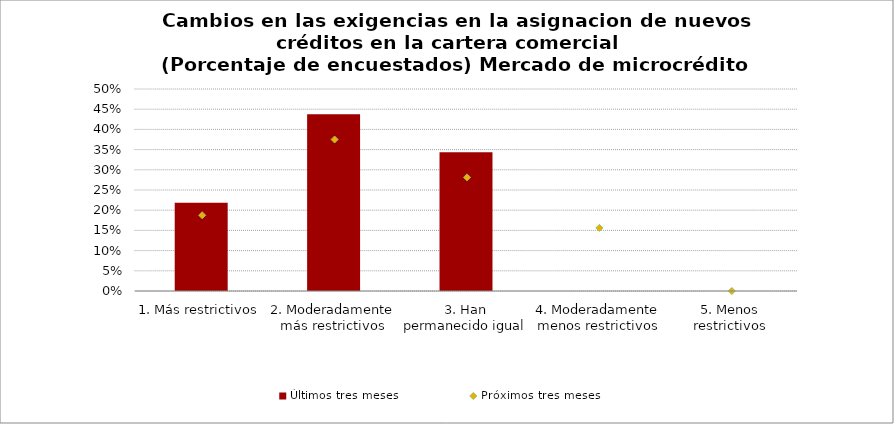
| Category | Últimos tres meses |
|---|---|
| 1. Más restrictivos | 0.219 |
| 2. Moderadamente más restrictivos | 0.438 |
| 3. Han permanecido igual | 0.344 |
| 4. Moderadamente menos restrictivos | 0 |
| 5. Menos restrictivos | 0 |